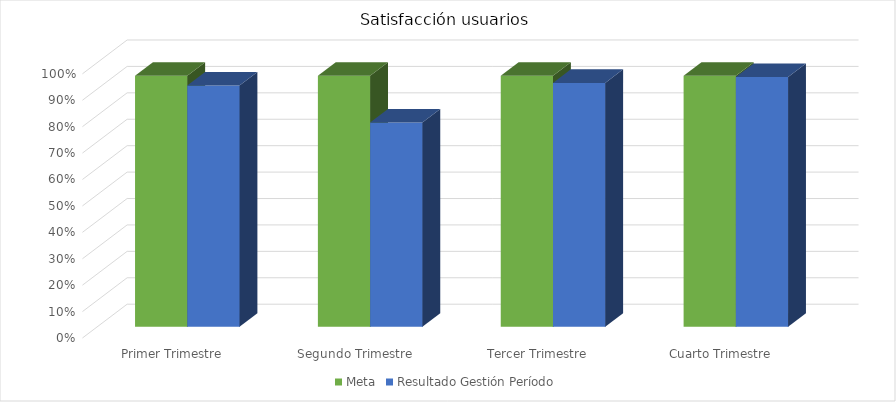
| Category | Meta | Resultado Gestión Período |
|---|---|---|
| Primer Trimestre | 0.95 | 0.913 |
| Segundo Trimestre | 0.95 | 0.773 |
| Tercer Trimestre | 0.95 | 0.923 |
| Cuarto Trimestre | 0.95 | 0.945 |